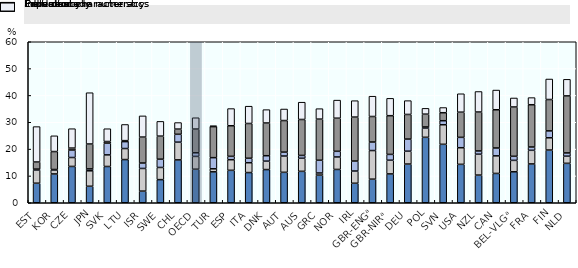
| Category | Education | Proficiency in numeracy | Field of study | Experience | Individual characteristics |
|---|---|---|---|---|---|
| EST | 7.28 | 4.921 | 0.334 | 2.656 | 13.185 |
| KOR | 10.736 | 1.501 | 0.149 | 6.693 | 5.872 |
| CZE | 13.535 | 3.327 | 2.795 | 0.719 | 7.226 |
| JPN | 6.148 | 5.754 | 0.708 | 9.288 | 19.113 |
| SVK | 13.521 | 4.318 | 4.365 | 0.62 | 4.76 |
| LTU | 16.095 | 4.114 | 2.574 | 0.365 | 6.019 |
| ISR | 4.334 | 8.447 | 2.023 | 9.67 | 7.898 |
| SWE | 8.615 | 4.537 | 3.083 | 8.599 | 5.489 |
| CHL | 15.978 | 6.608 | 2.926 | 1.934 | 2.442 |
| OECD | 12.496 | 4.77 | 1.361 | 8.834 | 4.217 |
| TUR | 11.52 | 1.136 | 4.154 | 11.563 | 0.325 |
| ESP | 12.083 | 3.961 | 1.254 | 11.402 | 6.399 |
| ITA | 11.255 | 3.664 | 1.664 | 12.957 | 6.448 |
| DNK | 12.371 | 3.133 | 2.027 | 12.191 | 4.982 |
| AUT | 11.342 | 6.068 | 1.451 | 11.776 | 4.301 |
| AUS | 11.705 | 4.874 | 1.055 | 13.4 | 6.44 |
| GRC | 10.306 | 0.786 | 4.747 | 15.328 | 3.897 |
| NOR | 12.42 | 4.646 | 2.108 | 12.335 | 6.74 |
| IRL | 7.262 | 4.554 | 3.728 | 16.38 | 6.112 |
| GBR-ENGᵃ | 8.793 | 10.665 | 3.172 | 9.514 | 7.568 |
| GBR-NIRᵃ | 10.747 | 5.108 | 2.164 | 14.429 | 6.467 |
| DEU | 14.418 | 4.793 | 4.517 | 9.183 | 5.146 |
| POL | 24.388 | 3.446 | 0.403 | 4.782 | 2.162 |
| SVN | 21.784 | 7.296 | 1.493 | 2.983 | 1.93 |
| USA | 14.314 | 6.196 | 3.864 | 9.378 | 6.867 |
| NZL | 10.311 | 7.785 | 1.21 | 14.508 | 7.639 |
| CAN | 10.927 | 6.553 | 2.924 | 14.256 | 7.338 |
| BEL-VLGᵃ | 11.534 | 4.26 | 1.522 | 18.374 | 3.356 |
| FRA | 14.466 | 5.078 | 1.237 | 15.746 | 2.661 |
| FIN | 19.642 | 4.566 | 2.576 | 11.69 | 7.643 |
| NLD | 14.689 | 2.665 | 1.212 | 21.257 | 6.175 |